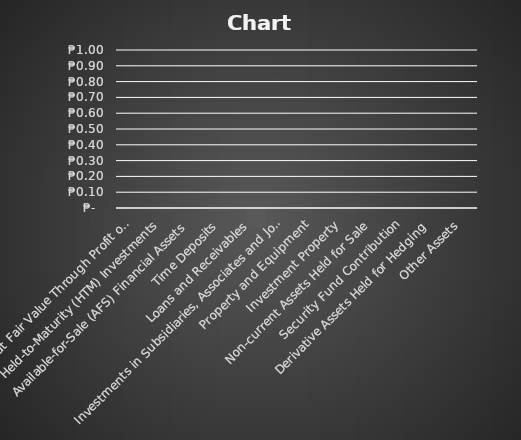
| Category | Series 3 |
|---|---|
| Financial Assets at Fair Value Through Profit or Loss | 0 |
| Held-to-Maturity (HTM) Investments | 0 |
| Available-for-Sale (AFS) Financial Assets | 0 |
| Time Deposits | 0 |
| Loans and Receivables | 0 |
| Investments in Subsidiaries, Associates and Joint Ventures | 0 |
| Property and Equipment | 0 |
| Investment Property | 0 |
| Non-current Assets Held for Sale | 0 |
| Security Fund Contribution | 0 |
| Derivative Assets Held for Hedging | 0 |
| Other Assets | 0 |